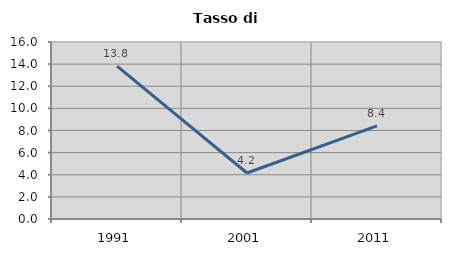
| Category | Tasso di disoccupazione   |
|---|---|
| 1991.0 | 13.826 |
| 2001.0 | 4.159 |
| 2011.0 | 8.416 |